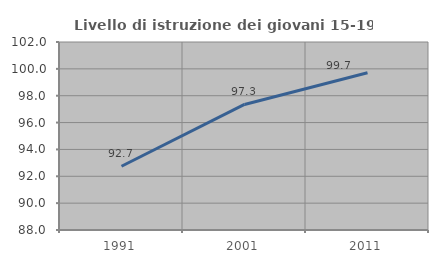
| Category | Livello di istruzione dei giovani 15-19 anni |
|---|---|
| 1991.0 | 92.748 |
| 2001.0 | 97.349 |
| 2011.0 | 99.709 |